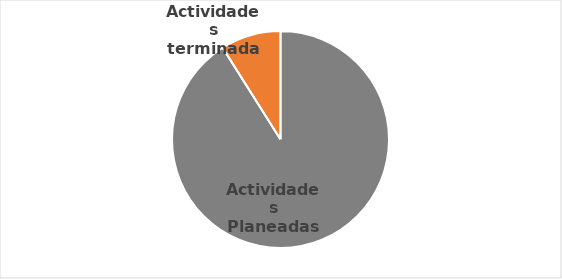
| Category | Series 0 |
|---|---|
| Actividades Planeadas | 61 |
| Actividades terminadas | 6 |